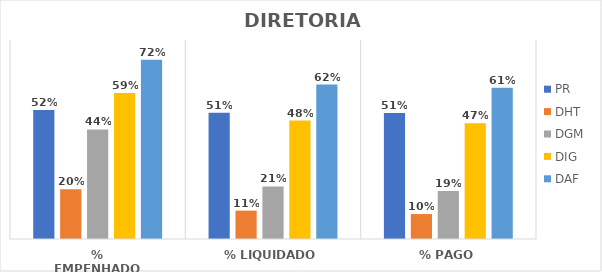
| Category | PR | DHT | DGM | DIG | DAF |
|---|---|---|---|---|---|
| % EMPENHADO | 0.519 | 0.2 | 0.44 | 0.586 | 0.721 |
| % LIQUIDADO | 0.507 | 0.114 | 0.211 | 0.476 | 0.621 |
| % PAGO | 0.506 | 0.1 | 0.192 | 0.466 | 0.608 |